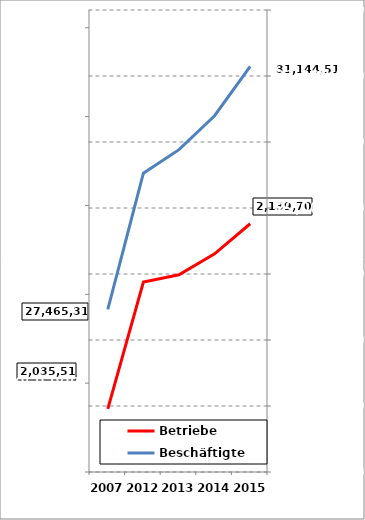
| Category | Betriebe |
|---|---|
| 2007.0 | 2035511 |
| 2012.0 | 2106938 |
| 2013.0 | 2110966 |
| 2014.0 | 2122802 |
| 2015.0 | 2139706 |